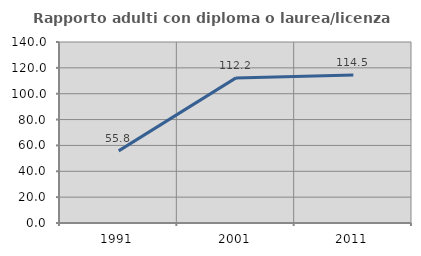
| Category | Rapporto adulti con diploma o laurea/licenza media  |
|---|---|
| 1991.0 | 55.805 |
| 2001.0 | 112.245 |
| 2011.0 | 114.474 |